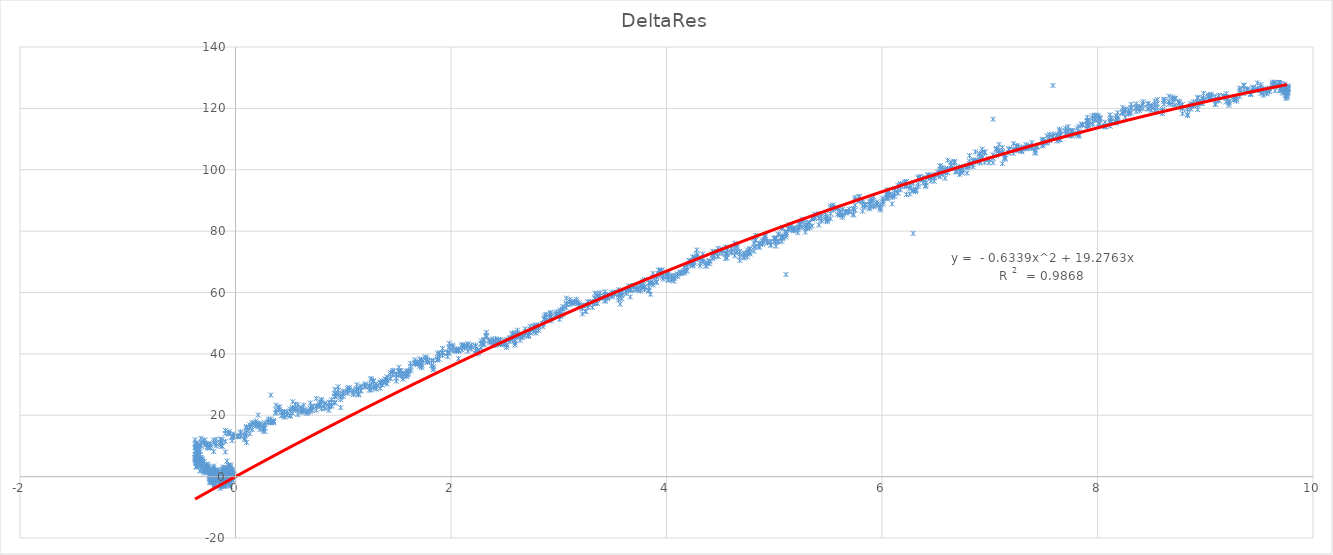
| Category | DeltaRes |
|---|---|
| 9.765999999999998 | 125.282 |
| 9.765999999999998 | 124.754 |
| 9.765999999999998 | 126.365 |
| 9.765999999999998 | 127.049 |
| 9.765999999999998 | 126.06 |
| 9.765999999999998 | 125.188 |
| 9.765999999999998 | 126.565 |
| 9.765999999999998 | 126.454 |
| 9.758 | 126.799 |
| 9.758 | 124.077 |
| 9.758 | 123.571 |
| 9.758 | 124.226 |
| 9.758 | 124.271 |
| 9.758 | 124.015 |
| 9.758 | 125.282 |
| 9.758 | 126.332 |
| 9.765999999999998 | 127.288 |
| 9.765999999999998 | 126.604 |
| 9.765999999999998 | 126.66 |
| 9.765999999999998 | 126.049 |
| 9.75 | 126.021 |
| 9.75 | 126.299 |
| 9.75 | 125.16 |
| 9.75 | 125.421 |
| 9.75 | 126.587 |
| 9.75 | 125.799 |
| 9.75 | 125.838 |
| 9.75 | 123.21 |
| 9.742 | 125.049 |
| 9.742 | 124.199 |
| 9.742 | 125.654 |
| 9.742 | 126.86 |
| 9.734000000000002 | 125.954 |
| 9.734000000000002 | 126.521 |
| 9.734000000000002 | 125.949 |
| 9.734000000000002 | 127.949 |
| 9.719000000000001 | 125.515 |
| 9.719000000000001 | 126.41 |
| 9.719000000000001 | 126.004 |
| 9.719000000000001 | 124.949 |
| 9.703 | 126.415 |
| 9.703 | 125.993 |
| 9.703 | 126.099 |
| 9.703 | 128.032 |
| 9.687999999999999 | 127.299 |
| 9.687999999999999 | 125.754 |
| 9.687999999999999 | 128.143 |
| 9.687999999999999 | 128.449 |
| 9.68 | 127.676 |
| 9.68 | 127.627 |
| 9.68 | 127.615 |
| 9.68 | 128.454 |
| 9.648 | 128.11 |
| 9.648 | 128.443 |
| 9.648 | 127.482 |
| 9.648 | 125.799 |
| 9.625 | 128.549 |
| 9.625 | 127.738 |
| 9.625 | 128.154 |
| 9.625 | 127.377 |
| 9.594000000000001 | 126.493 |
| 9.594000000000001 | 126.56 |
| 9.594000000000001 | 125.382 |
| 9.594000000000001 | 125.788 |
| 9.57 | 124.971 |
| 9.57 | 125.716 |
| 9.57 | 124.771 |
| 9.57 | 125.693 |
| 9.539000000000001 | 124.288 |
| 9.539000000000001 | 125.243 |
| 9.539000000000001 | 126.404 |
| 9.539000000000001 | 126.271 |
| 9.515999999999998 | 127.765 |
| 9.515999999999998 | 127.049 |
| 9.515999999999998 | 125.815 |
| 9.515999999999998 | 124.899 |
| 9.484000000000002 | 125.832 |
| 9.484000000000002 | 126.454 |
| 9.484000000000002 | 128.282 |
| 9.484000000000002 | 126.227 |
| 9.445 | 126.649 |
| 9.445 | 126.543 |
| 9.445 | 126.86 |
| 9.445 | 125.96 |
| 9.422 | 124.515 |
| 9.422 | 125.51 |
| 9.422 | 124.849 |
| 9.422 | 124.532 |
| 9.390999999999998 | 125.843 |
| 9.390999999999998 | 125.971 |
| 9.390999999999998 | 126.027 |
| 9.390999999999998 | 126.376 |
| 9.359000000000002 | 127.393 |
| 9.359000000000002 | 127.588 |
| 9.359000000000002 | 124.821 |
| 9.359000000000002 | 126.193 |
| 9.32 | 125.96 |
| 9.32 | 126.616 |
| 9.32 | 125.26 |
| 9.32 | 123.871 |
| 9.289000000000001 | 123.065 |
| 9.289000000000001 | 123.527 |
| 9.289000000000001 | 122.938 |
| 9.289000000000001 | 122.371 |
| 9.265999999999998 | 123.516 |
| 9.265999999999998 | 122.982 |
| 9.265999999999998 | 122.771 |
| 9.265999999999998 | 123.71 |
| 9.219000000000001 | 122.488 |
| 9.219000000000001 | 121.61 |
| 9.219000000000001 | 121.027 |
| 9.219000000000001 | 122.043 |
| 9.195 | 123.443 |
| 9.195 | 122.116 |
| 9.195 | 123.927 |
| 9.195 | 124.799 |
| 9.172 | 123.577 |
| 9.172 | 123.749 |
| 9.172 | 124.016 |
| 9.172 | 123.999 |
| 9.125 | 122.649 |
| 9.125 | 124.154 |
| 9.125 | 124.138 |
| 9.125 | 122.404 |
| 9.094000000000001 | 122.465 |
| 9.094000000000001 | 121.443 |
| 9.094000000000001 | 123.854 |
| 9.094000000000001 | 121.232 |
| 9.055 | 123.532 |
| 9.055 | 124.604 |
| 9.055 | 123.655 |
| 9.055 | 124.199 |
| 9.030999999999999 | 123.843 |
| 9.030999999999999 | 123.455 |
| 9.030999999999999 | 124.099 |
| 9.030999999999999 | 124.377 |
| 8.984000000000002 | 122.893 |
| 8.984000000000002 | 123.432 |
| 8.984000000000002 | 122.615 |
| 8.984000000000002 | 124.882 |
| 8.969000000000001 | 123.199 |
| 8.969000000000001 | 122.26 |
| 8.969000000000001 | 121.632 |
| 8.969000000000001 | 121.538 |
| 8.93 | 122.099 |
| 8.93 | 121.849 |
| 8.93 | 119.588 |
| 8.93 | 121.688 |
| 8.93 | 123.343 |
| 8.93 | 121.56 |
| 8.93 | 120.982 |
| 8.93 | 123.61 |
| 8.890999999999998 | 122.105 |
| 8.890999999999998 | 120.827 |
| 8.890999999999998 | 121.138 |
| 8.890999999999998 | 120.805 |
| 8.867 | 121.549 |
| 8.867 | 121.01 |
| 8.867 | 120.749 |
| 8.867 | 119.749 |
| 8.835999999999999 | 120.188 |
| 8.835999999999999 | 117.599 |
| 8.835999999999999 | 119.671 |
| 8.835999999999999 | 118.021 |
| 8.789000000000001 | 119.832 |
| 8.789000000000001 | 118.255 |
| 8.789000000000001 | 121.304 |
| 8.789000000000001 | 120.199 |
| 8.758 | 120.416 |
| 8.758 | 121.855 |
| 8.758 | 121.716 |
| 8.758 | 122.366 |
| 8.719000000000001 | 123.343 |
| 8.719000000000001 | 123.01 |
| 8.719000000000001 | 123.06 |
| 8.719000000000001 | 121.121 |
| 8.695 | 121.36 |
| 8.695 | 123.682 |
| 8.695 | 121.954 |
| 8.695 | 123.166 |
| 8.664000000000001 | 122.099 |
| 8.664000000000001 | 122.232 |
| 8.664000000000001 | 121.41 |
| 8.664000000000001 | 123.966 |
| 8.617 | 122.865 |
| 8.617 | 122.943 |
| 8.617 | 122.293 |
| 8.617 | 121.316 |
| 8.602 | 119.177 |
| 8.602 | 119.649 |
| 8.602 | 119.082 |
| 8.602 | 118.254 |
| 8.555 | 118.905 |
| 8.555 | 120.316 |
| 8.555 | 121.538 |
| 8.555 | 122.832 |
| 8.530999999999999 | 122.399 |
| 8.530999999999999 | 121.254 |
| 8.530999999999999 | 119.21 |
| 8.530999999999999 | 120.482 |
| 8.5 | 120.91 |
| 8.5 | 119.354 |
| 8.5 | 120.743 |
| 8.5 | 120.76 |
| 8.469000000000001 | 119.727 |
| 8.469000000000001 | 120.043 |
| 8.469000000000001 | 121.427 |
| 8.469000000000001 | 121.632 |
| 8.422 | 121.443 |
| 8.422 | 122.204 |
| 8.422 | 121.432 |
| 8.422 | 119.926 |
| 8.390999999999998 | 119.865 |
| 8.390999999999998 | 120.671 |
| 8.390999999999998 | 120.038 |
| 8.390999999999998 | 119.238 |
| 8.359000000000002 | 120.543 |
| 8.359000000000002 | 118.999 |
| 8.359000000000002 | 119.988 |
| 8.359000000000002 | 121.46 |
| 8.312000000000001 | 119.971 |
| 8.312000000000001 | 120.249 |
| 8.312000000000001 | 118.466 |
| 8.312000000000001 | 121.327 |
| 8.289000000000001 | 118.404 |
| 8.289000000000001 | 118.127 |
| 8.289000000000001 | 119.454 |
| 8.289000000000001 | 118.532 |
| 8.258 | 117.121 |
| 8.258 | 118.921 |
| 8.258 | 119.554 |
| 8.258 | 119.766 |
| 8.234000000000002 | 118.282 |
| 8.234000000000002 | 119.021 |
| 8.234000000000002 | 118.721 |
| 8.234000000000002 | 120.238 |
| 8.187999999999999 | 115.943 |
| 8.187999999999999 | 116.499 |
| 8.187999999999999 | 117.193 |
| 8.187999999999999 | 118.61 |
| 8.172 | 117.627 |
| 8.172 | 115.549 |
| 8.172 | 115.21 |
| 8.172 | 116.738 |
| 8.125 | 115.915 |
| 8.125 | 115.56 |
| 8.125 | 116.91 |
| 8.125 | 115.965 |
| 8.117 | 114.215 |
| 8.117 | 117.91 |
| 8.117 | 116.321 |
| 8.117 | 115.616 |
| 8.07 | 114.26 |
| 8.07 | 113.954 |
| 8.07 | 115.504 |
| 8.07 | 114.093 |
| 8.023 | 115.038 |
| 8.023 | 116.643 |
| 8.023 | 117.026 |
| 8.023 | 116.421 |
| 8.008 | 117.732 |
| 8.008 | 116.643 |
| 8.008 | 117.115 |
| 8.008 | 115.065 |
| 7.977 | 116.082 |
| 7.977 | 116.61 |
| 7.977 | 117.543 |
| 7.977 | 117.838 |
| 7.952999999999999 | 116.621 |
| 7.952999999999999 | 114.754 |
| 7.952999999999999 | 115.254 |
| 7.952999999999999 | 117.543 |
| 7.9140000000000015 | 115.86 |
| 7.9140000000000015 | 115.832 |
| 7.9140000000000015 | 114.854 |
| 7.9140000000000015 | 114.388 |
| 7.905999999999999 | 114.521 |
| 7.905999999999999 | 115.688 |
| 7.905999999999999 | 115.777 |
| 7.905999999999999 | 116.071 |
| 7.905999999999999 | 115.132 |
| 7.905999999999999 | 117.071 |
| 7.905999999999999 | 114.149 |
| 7.905999999999999 | 113.393 |
| 7.859000000000002 | 114.499 |
| 7.859000000000002 | 114.693 |
| 7.859000000000002 | 114.56 |
| 7.859000000000002 | 114.899 |
| 7.827999999999999 | 114.177 |
| 7.827999999999999 | 112.438 |
| 7.827999999999999 | 111.426 |
| 7.827999999999999 | 110.904 |
| 7.812000000000001 | 111.954 |
| 7.812000000000001 | 111.36 |
| 7.812000000000001 | 111.793 |
| 7.812000000000001 | 113.582 |
| 7.765999999999998 | 112.621 |
| 7.765999999999998 | 112.699 |
| 7.765999999999998 | 111.154 |
| 7.765999999999998 | 112.81 |
| 7.757999999999999 | 112.288 |
| 7.757999999999999 | 111.01 |
| 7.757999999999999 | 112.621 |
| 7.757999999999999 | 112.388 |
| 7.727 | 114.06 |
| 7.727 | 112.377 |
| 7.727 | 111.099 |
| 7.727 | 112.593 |
| 7.702999999999999 | 112.727 |
| 7.702999999999999 | 113.571 |
| 7.702999999999999 | 112.627 |
| 7.702999999999999 | 111.693 |
| 7.648 | 113.221 |
| 7.648 | 110.882 |
| 7.648 | 112.721 |
| 7.648 | 109.888 |
| 7.655999999999999 | 112.371 |
| 7.655999999999999 | 111.327 |
| 7.655999999999999 | 111.332 |
| 7.655999999999999 | 109.716 |
| 7.625 | 109.327 |
| 7.625 | 111.443 |
| 7.625 | 110.932 |
| 7.625 | 111.204 |
| 7.5859999999999985 | 110.888 |
| 7.5859999999999985 | 127.464 |
| 7.5859999999999985 | 110.782 |
| 7.5859999999999985 | 111.643 |
| 7.555 | 111.504 |
| 7.555 | 109.699 |
| 7.555 | 110.393 |
| 7.555 | 109.477 |
| 7.530999999999999 | 108.871 |
| 7.530999999999999 | 111.082 |
| 7.530999999999999 | 108.671 |
| 7.530999999999999 | 109.304 |
| 7.492000000000001 | 107.804 |
| 7.492000000000001 | 109.765 |
| 7.492000000000001 | 107.91 |
| 7.492000000000001 | 108.399 |
| 7.492000000000001 | 109.204 |
| 7.492000000000001 | 108.999 |
| 7.492000000000001 | 109.615 |
| 7.492000000000001 | 109.927 |
| 7.437999999999999 | 107.51 |
| 7.437999999999999 | 107.638 |
| 7.437999999999999 | 107.46 |
| 7.437999999999999 | 107.621 |
| 7.422000000000001 | 105.382 |
| 7.422000000000001 | 105.766 |
| 7.422000000000001 | 106.343 |
| 7.422000000000001 | 107.304 |
| 7.390999999999998 | 107.216 |
| 7.390999999999998 | 108.827 |
| 7.390999999999998 | 107.521 |
| 7.390999999999998 | 106.904 |
| 7.359000000000002 | 107.816 |
| 7.359000000000002 | 107.488 |
| 7.359000000000002 | 107.182 |
| 7.359000000000002 | 107.693 |
| 7.3359999999999985 | 108.221 |
| 7.3359999999999985 | 106.799 |
| 7.3359999999999985 | 107.265 |
| 7.3359999999999985 | 106.96 |
| 7.297000000000001 | 107.388 |
| 7.297000000000001 | 106.182 |
| 7.297000000000001 | 106.815 |
| 7.297000000000001 | 105.893 |
| 7.265999999999998 | 106.149 |
| 7.265999999999998 | 106.71 |
| 7.265999999999998 | 106.604 |
| 7.265999999999998 | 107.343 |
| 7.25 | 107.593 |
| 7.25 | 107.621 |
| 7.25 | 106.443 |
| 7.25 | 107.91 |
| 7.219000000000001 | 106.377 |
| 7.219000000000001 | 108.499 |
| 7.219000000000001 | 106.704 |
| 7.219000000000001 | 105.371 |
| 7.18 | 105.454 |
| 7.18 | 106.732 |
| 7.18 | 106.516 |
| 7.18 | 106.793 |
| 7.140999999999998 | 104.91 |
| 7.140999999999998 | 103.705 |
| 7.140999999999998 | 103.504 |
| 7.140999999999998 | 104.116 |
| 7.117000000000001 | 101.982 |
| 7.117000000000001 | 105.521 |
| 7.117000000000001 | 105.915 |
| 7.117000000000001 | 107.277 |
| 7.0859999999999985 | 105.432 |
| 7.0859999999999985 | 106.16 |
| 7.0859999999999985 | 106.343 |
| 7.0859999999999985 | 108.227 |
| 7.062000000000001 | 106.449 |
| 7.062000000000001 | 106.738 |
| 7.062000000000001 | 104.616 |
| 7.062000000000001 | 106.949 |
| 7.030999999999999 | 116.471 |
| 7.030999999999999 | 104.843 |
| 7.030999999999999 | 102.293 |
| 7.030999999999999 | 103.788 |
| 6.992000000000001 | 103.616 |
| 6.992000000000001 | 103.332 |
| 6.992000000000001 | 103.393 |
| 6.992000000000001 | 102.271 |
| 6.952999999999999 | 102.393 |
| 6.952999999999999 | 105.671 |
| 6.952999999999999 | 105.605 |
| 6.952999999999999 | 105.827 |
| 6.93 | 106.727 |
| 6.93 | 105.771 |
| 6.93 | 104.327 |
| 6.93 | 103.904 |
| 6.905999999999999 | 105.138 |
| 6.905999999999999 | 102.643 |
| 6.905999999999999 | 102.204 |
| 6.905999999999999 | 103.549 |
| 6.905999999999999 | 103.054 |
| 6.905999999999999 | 104.26 |
| 6.905999999999999 | 105.243 |
| 6.905999999999999 | 105.277 |
| 6.867000000000001 | 105.821 |
| 6.867000000000001 | 102.954 |
| 6.867000000000001 | 102.66 |
| 6.867000000000001 | 103.188 |
| 6.844000000000001 | 100.977 |
| 6.844000000000001 | 101.688 |
| 6.844000000000001 | 102.799 |
| 6.844000000000001 | 103.043 |
| 6.812000000000001 | 104.593 |
| 6.812000000000001 | 102.793 |
| 6.812000000000001 | 101.993 |
| 6.812000000000001 | 101.171 |
| 6.7890000000000015 | 100.632 |
| 6.7890000000000015 | 98.899 |
| 6.7890000000000015 | 100.96 |
| 6.7890000000000015 | 101.293 |
| 6.742000000000001 | 99.866 |
| 6.742000000000001 | 100.199 |
| 6.742000000000001 | 99.571 |
| 6.742000000000001 | 98.971 |
| 6.719000000000001 | 98.471 |
| 6.719000000000001 | 100.388 |
| 6.719000000000001 | 99.91 |
| 6.719000000000001 | 100.999 |
| 6.687999999999999 | 99.482 |
| 6.687999999999999 | 99.654 |
| 6.687999999999999 | 99.216 |
| 6.687999999999999 | 100.516 |
| 6.672000000000001 | 100.349 |
| 6.672000000000001 | 102.51 |
| 6.672000000000001 | 102.166 |
| 6.672000000000001 | 102.721 |
| 6.640999999999998 | 101.177 |
| 6.640999999999998 | 102.493 |
| 6.640999999999998 | 101.477 |
| 6.640999999999998 | 100.488 |
| 6.609000000000002 | 99.916 |
| 6.609000000000002 | 103.071 |
| 6.609000000000002 | 100.41 |
| 6.609000000000002 | 99.06 |
| 6.5859999999999985 | 97.182 |
| 6.5859999999999985 | 99.766 |
| 6.5859999999999985 | 100.343 |
| 6.5859999999999985 | 98.916 |
| 6.562000000000001 | 98.56 |
| 6.562000000000001 | 99.943 |
| 6.562000000000001 | 99.354 |
| 6.562000000000001 | 100.827 |
| 6.5390000000000015 | 101.299 |
| 6.5390000000000015 | 101.154 |
| 6.5390000000000015 | 100.132 |
| 6.5390000000000015 | 97.693 |
| 6.523 | 98.288 |
| 6.523 | 98.271 |
| 6.523 | 98.971 |
| 6.523 | 99.332 |
| 6.484000000000002 | 97.782 |
| 6.484000000000002 | 98.432 |
| 6.484000000000002 | 97.36 |
| 6.484000000000002 | 96.26 |
| 6.452999999999999 | 96.343 |
| 6.452999999999999 | 98.016 |
| 6.452999999999999 | 97.238 |
| 6.452999999999999 | 97.505 |
| 6.43 | 98.377 |
| 6.43 | 98.293 |
| 6.43 | 97.921 |
| 6.43 | 97.405 |
| 6.405999999999999 | 94.877 |
| 6.405999999999999 | 94.555 |
| 6.405999999999999 | 95.693 |
| 6.405999999999999 | 95.749 |
| 6.382999999999999 | 96.849 |
| 6.382999999999999 | 96.816 |
| 6.382999999999999 | 97.532 |
| 6.382999999999999 | 95.688 |
| 6.352 | 96.838 |
| 6.352 | 96.927 |
| 6.352 | 97.76 |
| 6.352 | 97.638 |
| 6.3359999999999985 | 97.377 |
| 6.3359999999999985 | 97.343 |
| 6.3359999999999985 | 95.243 |
| 6.3359999999999985 | 94.555 |
| 6.312000000000001 | 93.255 |
| 6.312000000000001 | 93.682 |
| 6.312000000000001 | 93.432 |
| 6.312000000000001 | 92.86 |
| 6.2890000000000015 | 93.399 |
| 6.2890000000000015 | 93.027 |
| 6.2890000000000015 | 79.255 |
| 6.2890000000000015 | 95.455 |
| 6.257999999999999 | 92.099 |
| 6.257999999999999 | 94.866 |
| 6.257999999999999 | 94.855 |
| 6.257999999999999 | 93.827 |
| 6.227 | 91.921 |
| 6.227 | 94.516 |
| 6.227 | 94.66 |
| 6.227 | 96.166 |
| 6.2109999999999985 | 95.632 |
| 6.2109999999999985 | 95.294 |
| 6.2109999999999985 | 94.521 |
| 6.2109999999999985 | 96.116 |
| 6.172000000000001 | 94.671 |
| 6.172000000000001 | 93.438 |
| 6.172000000000001 | 95.171 |
| 6.172000000000001 | 95.477 |
| 6.148 | 92.455 |
| 6.148 | 94.932 |
| 6.148 | 93.682 |
| 6.148 | 92.455 |
| 6.117000000000001 | 93.849 |
| 6.117000000000001 | 91.36 |
| 6.117000000000001 | 92.088 |
| 6.117000000000001 | 93.232 |
| 6.094000000000001 | 90.938 |
| 6.094000000000001 | 88.883 |
| 6.094000000000001 | 91.738 |
| 6.094000000000001 | 91.432 |
| 6.062000000000001 | 91.56 |
| 6.062000000000001 | 93.16 |
| 6.062000000000001 | 91.877 |
| 6.062000000000001 | 91.777 |
| 6.047000000000001 | 93.488 |
| 6.047000000000001 | 91.844 |
| 6.047000000000001 | 90.66 |
| 6.047000000000001 | 90.577 |
| 6.047000000000001 | 92.482 |
| 6.047000000000001 | 91.066 |
| 6.047000000000001 | 90.982 |
| 6.047000000000001 | 91.788 |
| 6.007999999999999 | 90.044 |
| 6.007999999999999 | 90.682 |
| 6.007999999999999 | 88.766 |
| 6.007999999999999 | 89.449 |
| 5.984000000000002 | 87.732 |
| 5.984000000000002 | 87.466 |
| 5.984000000000002 | 86.899 |
| 5.984000000000002 | 88.494 |
| 5.952999999999999 | 88.355 |
| 5.952999999999999 | 88.827 |
| 5.952999999999999 | 89.527 |
| 5.952999999999999 | 88.732 |
| 5.922000000000001 | 87.899 |
| 5.922000000000001 | 88.232 |
| 5.922000000000001 | 90.044 |
| 5.922000000000001 | 91.21 |
| 5.898 | 89.577 |
| 5.898 | 89.949 |
| 5.898 | 90.571 |
| 5.898 | 88.071 |
| 5.882999999999999 | 87.521 |
| 5.882999999999999 | 89.527 |
| 5.882999999999999 | 88.727 |
| 5.882999999999999 | 87.293 |
| 5.844000000000001 | 88.716 |
| 5.844000000000001 | 88.705 |
| 5.844000000000001 | 87.888 |
| 5.844000000000001 | 88.51 |
| 5.82 | 89.488 |
| 5.82 | 86.493 |
| 5.82 | 88.171 |
| 5.82 | 90.105 |
| 5.7890000000000015 | 89.755 |
| 5.7890000000000015 | 91.082 |
| 5.7890000000000015 | 89.955 |
| 5.7890000000000015 | 91.31 |
| 5.75 | 90.993 |
| 5.75 | 90.332 |
| 5.75 | 88.482 |
| 5.75 | 86.788 |
| 5.734000000000002 | 87.044 |
| 5.734000000000002 | 85.243 |
| 5.734000000000002 | 85.538 |
| 5.734000000000002 | 87.427 |
| 5.695 | 86.243 |
| 5.695 | 86.36 |
| 5.695 | 86.366 |
| 5.695 | 87.221 |
| 5.6640000000000015 | 85.832 |
| 5.6640000000000015 | 86.327 |
| 5.6640000000000015 | 86.244 |
| 5.6640000000000015 | 86.455 |
| 5.632999999999999 | 85.455 |
| 5.632999999999999 | 84.516 |
| 5.632999999999999 | 85.16 |
| 5.632999999999999 | 87.105 |
| 5.609000000000002 | 85.91 |
| 5.609000000000002 | 86.855 |
| 5.609000000000002 | 86.005 |
| 5.609000000000002 | 85.144 |
| 5.5859999999999985 | 85.46 |
| 5.5859999999999985 | 87.377 |
| 5.5859999999999985 | 87.243 |
| 5.5859999999999985 | 87.599 |
| 5.547000000000001 | 86.844 |
| 5.547000000000001 | 87.899 |
| 5.547000000000001 | 88.493 |
| 5.547000000000001 | 87.521 |
| 5.523 | 87.649 |
| 5.523 | 88.193 |
| 5.523 | 85.688 |
| 5.523 | 84.038 |
| 5.492000000000001 | 83.416 |
| 5.492000000000001 | 83.088 |
| 5.492000000000001 | 83.777 |
| 5.492000000000001 | 84.221 |
| 5.477 | 84.082 |
| 5.477 | 84.688 |
| 5.477 | 84.749 |
| 5.477 | 85.36 |
| 5.437999999999999 | 83.605 |
| 5.437999999999999 | 83.321 |
| 5.437999999999999 | 85.521 |
| 5.437999999999999 | 84.821 |
| 5.4140000000000015 | 84.16 |
| 5.4140000000000015 | 81.994 |
| 5.4140000000000015 | 85.605 |
| 5.4140000000000015 | 84.216 |
| 5.375 | 84.066 |
| 5.375 | 84.527 |
| 5.375 | 85.494 |
| 5.375 | 84.538 |
| 5.352 | 84.299 |
| 5.352 | 84.205 |
| 5.352 | 83.899 |
| 5.352 | 81.671 |
| 5.327999999999999 | 82.738 |
| 5.327999999999999 | 82.816 |
| 5.327999999999999 | 81.305 |
| 5.327999999999999 | 81.049 |
| 5.305 | 81.966 |
| 5.305 | 80.894 |
| 5.305 | 82.371 |
| 5.305 | 81.921 |
| 5.2890000000000015 | 80.91 |
| 5.2890000000000015 | 79.683 |
| 5.2890000000000015 | 83.794 |
| 5.2890000000000015 | 81.577 |
| 5.257999999999999 | 83.183 |
| 5.257999999999999 | 83.094 |
| 5.257999999999999 | 83.905 |
| 5.257999999999999 | 81.344 |
| 5.234000000000002 | 82.899 |
| 5.234000000000002 | 81.288 |
| 5.234000000000002 | 82.477 |
| 5.234000000000002 | 81.916 |
| 5.219000000000001 | 80.471 |
| 5.219000000000001 | 81.044 |
| 5.219000000000001 | 79.477 |
| 5.219000000000001 | 81.177 |
| 5.18 | 80.483 |
| 5.18 | 80.927 |
| 5.18 | 80.255 |
| 5.18 | 80.094 |
| 5.1640000000000015 | 80.755 |
| 5.1640000000000015 | 80.783 |
| 5.1640000000000015 | 80.41 |
| 5.1640000000000015 | 82.171 |
| 5.132999999999999 | 82.038 |
| 5.132999999999999 | 80.938 |
| 5.132999999999999 | 80.555 |
| 5.132999999999999 | 80.81 |
| 5.109000000000002 | 79.633 |
| 5.109000000000002 | 78.96 |
| 5.109000000000002 | 79.633 |
| 5.109000000000002 | 79.638 |
| 5.109000000000002 | 78.116 |
| 5.109000000000002 | 65.849 |
| 5.109000000000002 | 78.883 |
| 5.109000000000002 | 79.488 |
| 5.077999999999999 | 77.46 |
| 5.077999999999999 | 78.477 |
| 5.077999999999999 | 77.949 |
| 5.077999999999999 | 81.16 |
| 5.07 | 80.849 |
| 5.07 | 78.31 |
| 5.07 | 78.049 |
| 5.07 | 76.66 |
| 5.0390000000000015 | 78.805 |
| 5.0390000000000015 | 76.744 |
| 5.0390000000000015 | 79.071 |
| 5.0390000000000015 | 76.521 |
| 5.015999999999998 | 76.366 |
| 5.015999999999998 | 77.733 |
| 5.015999999999998 | 77.499 |
| 5.015999999999998 | 75.077 |
| 5.0 | 76.56 |
| 5.0 | 77.705 |
| 5.0 | 77.56 |
| 5.0 | 77.71 |
| 4.969000000000001 | 76.616 |
| 4.969000000000001 | 75.516 |
| 4.969000000000001 | 75.438 |
| 4.969000000000001 | 75.46 |
| 4.937999999999999 | 76.76 |
| 4.937999999999999 | 76.133 |
| 4.937999999999999 | 76.294 |
| 4.937999999999999 | 76.338 |
| 4.9140000000000015 | 77.766 |
| 4.9140000000000015 | 77.216 |
| 4.9140000000000015 | 78.538 |
| 4.9140000000000015 | 78.249 |
| 4.890999999999998 | 77.094 |
| 4.890999999999998 | 76.572 |
| 4.890999999999998 | 75.999 |
| 4.890999999999998 | 75.705 |
| 4.859000000000002 | 74.666 |
| 4.859000000000002 | 76.122 |
| 4.859000000000002 | 75.899 |
| 4.859000000000002 | 75.06 |
| 4.827999999999999 | 75.077 |
| 4.827999999999999 | 77.11 |
| 4.827999999999999 | 78.56 |
| 4.827999999999999 | 77.044 |
| 4.812000000000001 | 77.683 |
| 4.812000000000001 | 76.216 |
| 4.812000000000001 | 74.783 |
| 4.812000000000001 | 73.422 |
| 4.773 | 72.966 |
| 4.773 | 72.577 |
| 4.773 | 74.321 |
| 4.773 | 74.127 |
| 4.75 | 73.855 |
| 4.75 | 73.038 |
| 4.75 | 71.616 |
| 4.75 | 72.522 |
| 4.719000000000001 | 71.716 |
| 4.719000000000001 | 72.899 |
| 4.719000000000001 | 71.255 |
| 4.719000000000001 | 72.372 |
| 4.68 | 72.549 |
| 4.68 | 73.433 |
| 4.68 | 70.433 |
| 4.68 | 71.699 |
| 4.655999999999999 | 74.777 |
| 4.655999999999999 | 73.271 |
| 4.655999999999999 | 73.305 |
| 4.655999999999999 | 75.316 |
| 4.632999999999999 | 76.06 |
| 4.632999999999999 | 74.666 |
| 4.632999999999999 | 73.277 |
| 4.632999999999999 | 71.949 |
| 4.602 | 74.394 |
| 4.602 | 72.888 |
| 4.602 | 73.266 |
| 4.602 | 74.177 |
| 4.562000000000001 | 72.366 |
| 4.562000000000001 | 71.205 |
| 4.562000000000001 | 72.777 |
| 4.562000000000001 | 73.849 |
| 4.547000000000001 | 74.849 |
| 4.547000000000001 | 72.899 |
| 4.547000000000001 | 72.416 |
| 4.547000000000001 | 71.138 |
| 4.515999999999998 | 72.71 |
| 4.515999999999998 | 74.194 |
| 4.515999999999998 | 73.799 |
| 4.515999999999998 | 73.627 |
| 4.477 | 73.255 |
| 4.477 | 74.405 |
| 4.477 | 71.855 |
| 4.477 | 71.772 |
| 4.445 | 73.272 |
| 4.445 | 71.51 |
| 4.445 | 72.944 |
| 4.445 | 72.888 |
| 4.43 | 72.127 |
| 4.43 | 72.51 |
| 4.43 | 73.427 |
| 4.43 | 71.038 |
| 4.398 | 70.344 |
| 4.398 | 70.238 |
| 4.398 | 69.36 |
| 4.398 | 69.994 |
| 4.367000000000001 | 69.51 |
| 4.367000000000001 | 68.705 |
| 4.367000000000001 | 69.672 |
| 4.367000000000001 | 68.56 |
| 4.3359999999999985 | 70.205 |
| 4.3359999999999985 | 72.555 |
| 4.3359999999999985 | 70.983 |
| 4.3359999999999985 | 70.044 |
| 4.312000000000001 | 68.683 |
| 4.312000000000001 | 69.499 |
| 4.312000000000001 | 70.855 |
| 4.312000000000001 | 71.249 |
| 4.280999999999999 | 73.855 |
| 4.280999999999999 | 71.877 |
| 4.280999999999999 | 71.883 |
| 4.280999999999999 | 72.649 |
| 4.257999999999999 | 71.372 |
| 4.257999999999999 | 71.394 |
| 4.257999999999999 | 70.01 |
| 4.257999999999999 | 69.538 |
| 4.242000000000001 | 68.749 |
| 4.242000000000001 | 69.922 |
| 4.242000000000001 | 68.999 |
| 4.242000000000001 | 71.633 |
| 4.242000000000001 | 68.772 |
| 4.242000000000001 | 69.338 |
| 4.242000000000001 | 68.722 |
| 4.242000000000001 | 69.388 |
| 4.2109999999999985 | 70.366 |
| 4.2109999999999985 | 69.622 |
| 4.2109999999999985 | 70.438 |
| 4.2109999999999985 | 69.394 |
| 4.187999999999999 | 68.877 |
| 4.187999999999999 | 67.26 |
| 4.187999999999999 | 68.033 |
| 4.187999999999999 | 66.944 |
| 4.1640000000000015 | 67.188 |
| 4.1640000000000015 | 68.305 |
| 4.1640000000000015 | 66.36 |
| 4.1640000000000015 | 66.705 |
| 4.132999999999999 | 66.177 |
| 4.132999999999999 | 66.388 |
| 4.132999999999999 | 66.31 |
| 4.132999999999999 | 66.716 |
| 4.102 | 66.055 |
| 4.102 | 65.899 |
| 4.102 | 65.238 |
| 4.102 | 65.255 |
| 4.07 | 65.555 |
| 4.07 | 63.699 |
| 4.07 | 64.544 |
| 4.07 | 64.827 |
| 4.047000000000001 | 65.466 |
| 4.047000000000001 | 65.333 |
| 4.047000000000001 | 64.277 |
| 4.047000000000001 | 64.105 |
| 4.015999999999998 | 64.005 |
| 4.015999999999998 | 65.016 |
| 4.015999999999998 | 64.205 |
| 4.015999999999998 | 65.91 |
| 4.007999999999999 | 66.005 |
| 4.007999999999999 | 65.144 |
| 4.007999999999999 | 65.566 |
| 4.007999999999999 | 66.222 |
| 3.969000000000001 | 64.394 |
| 3.969000000000001 | 65.899 |
| 3.969000000000001 | 65.172 |
| 3.969000000000001 | 65.066 |
| 3.9529999999999994 | 67.249 |
| 3.9529999999999994 | 66.772 |
| 3.9529999999999994 | 67.272 |
| 3.9529999999999994 | 67.222 |
| 3.9299999999999997 | 67.316 |
| 3.9299999999999997 | 67.199 |
| 3.9299999999999997 | 66.066 |
| 3.9299999999999997 | 65.46 |
| 3.905999999999999 | 63.51 |
| 3.905999999999999 | 63.233 |
| 3.905999999999999 | 64.977 |
| 3.905999999999999 | 65.149 |
| 3.875 | 66.199 |
| 3.875 | 63.072 |
| 3.875 | 64.888 |
| 3.875 | 62.472 |
| 3.8520000000000003 | 63.166 |
| 3.8520000000000003 | 62.944 |
| 3.8520000000000003 | 59.438 |
| 3.8520000000000003 | 63.361 |
| 3.8359999999999985 | 60.405 |
| 3.8359999999999985 | 63.216 |
| 3.8359999999999985 | 60.738 |
| 3.8359999999999985 | 61.666 |
| 3.7970000000000006 | 61.655 |
| 3.7970000000000006 | 60.944 |
| 3.7970000000000006 | 61.855 |
| 3.7970000000000006 | 64.277 |
| 3.780999999999999 | 62.088 |
| 3.780999999999999 | 63.81 |
| 3.780999999999999 | 62.577 |
| 3.780999999999999 | 61.672 |
| 3.757999999999999 | 60.488 |
| 3.757999999999999 | 62.383 |
| 3.757999999999999 | 61.155 |
| 3.757999999999999 | 61.838 |
| 3.7270000000000003 | 60.749 |
| 3.7270000000000003 | 61.072 |
| 3.7270000000000003 | 61.494 |
| 3.7270000000000003 | 62.349 |
| 3.6950000000000003 | 62.055 |
| 3.6950000000000003 | 62.16 |
| 3.6950000000000003 | 60.91 |
| 3.6950000000000003 | 62.099 |
| 3.6640000000000015 | 61.061 |
| 3.6640000000000015 | 58.555 |
| 3.6640000000000015 | 60.916 |
| 3.6640000000000015 | 60.638 |
| 3.6479999999999997 | 61.277 |
| 3.6479999999999997 | 61.138 |
| 3.6479999999999997 | 60.788 |
| 3.6479999999999997 | 62.133 |
| 3.625 | 60.355 |
| 3.625 | 60.438 |
| 3.625 | 59.633 |
| 3.625 | 60.533 |
| 3.5859999999999985 | 57.955 |
| 3.5859999999999985 | 59.811 |
| 3.5859999999999985 | 60.027 |
| 3.5859999999999985 | 59.172 |
| 3.5700000000000003 | 59.955 |
| 3.5700000000000003 | 59.516 |
| 3.5700000000000003 | 59.96 |
| 3.5700000000000003 | 56.205 |
| 3.5549999999999997 | 57.611 |
| 3.5549999999999997 | 58.433 |
| 3.5549999999999997 | 59.372 |
| 3.5549999999999997 | 60.905 |
| 3.5159999999999982 | 59.566 |
| 3.5159999999999982 | 60.199 |
| 3.5159999999999982 | 59.938 |
| 3.5159999999999982 | 59.399 |
| 3.492000000000001 | 59.177 |
| 3.492000000000001 | 59.91 |
| 3.492000000000001 | 58.799 |
| 3.492000000000001 | 58.583 |
| 3.4529999999999994 | 59.316 |
| 3.4529999999999994 | 58.288 |
| 3.4529999999999994 | 58.011 |
| 3.4529999999999994 | 58.594 |
| 3.4299999999999997 | 59.405 |
| 3.4299999999999997 | 58.749 |
| 3.4299999999999997 | 58.411 |
| 3.4299999999999997 | 57.133 |
| 3.4299999999999997 | 57.455 |
| 3.4299999999999997 | 60.238 |
| 3.4299999999999997 | 58.466 |
| 3.4299999999999997 | 58.377 |
| 3.382999999999999 | 58.866 |
| 3.382999999999999 | 58.149 |
| 3.382999999999999 | 59.955 |
| 3.382999999999999 | 58.144 |
| 3.3590000000000018 | 59.511 |
| 3.3590000000000018 | 56.472 |
| 3.3590000000000018 | 56.433 |
| 3.3590000000000018 | 58.699 |
| 3.3359999999999985 | 56.366 |
| 3.3359999999999985 | 59.777 |
| 3.3359999999999985 | 58.249 |
| 3.3359999999999985 | 57.888 |
| 3.312000000000001 | 56.799 |
| 3.312000000000001 | 55.161 |
| 3.312000000000001 | 56.655 |
| 3.312000000000001 | 57.105 |
| 3.2729999999999997 | 57.016 |
| 3.2729999999999997 | 56.927 |
| 3.2729999999999997 | 56.149 |
| 3.2729999999999997 | 55.161 |
| 3.25 | 53.755 |
| 3.25 | 53.888 |
| 3.25 | 55.744 |
| 3.25 | 55.811 |
| 3.219000000000001 | 55.783 |
| 3.219000000000001 | 54.922 |
| 3.219000000000001 | 54.727 |
| 3.219000000000001 | 53.005 |
| 3.187999999999999 | 55.527 |
| 3.187999999999999 | 55.649 |
| 3.187999999999999 | 56.027 |
| 3.187999999999999 | 56.599 |
| 3.1640000000000015 | 56.949 |
| 3.1640000000000015 | 56.666 |
| 3.1640000000000015 | 57.094 |
| 3.1640000000000015 | 57.772 |
| 3.132999999999999 | 56.627 |
| 3.132999999999999 | 56.622 |
| 3.132999999999999 | 56.994 |
| 3.132999999999999 | 56.416 |
| 3.1020000000000003 | 56.905 |
| 3.1020000000000003 | 57.722 |
| 3.1020000000000003 | 56.094 |
| 3.1020000000000003 | 57.044 |
| 3.0700000000000003 | 58.155 |
| 3.0700000000000003 | 56.083 |
| 3.0700000000000003 | 56.511 |
| 3.0700000000000003 | 54.977 |
| 3.0390000000000015 | 54.516 |
| 3.0390000000000015 | 55.416 |
| 3.0390000000000015 | 54.711 |
| 3.0390000000000015 | 52.866 |
| 3.0159999999999982 | 52.316 |
| 3.0159999999999982 | 54.316 |
| 3.0159999999999982 | 52.633 |
| 3.0159999999999982 | 52.177 |
| 3.007999999999999 | 51.255 |
| 3.007999999999999 | 52.933 |
| 3.007999999999999 | 53.922 |
| 3.007999999999999 | 53.444 |
| 2.9770000000000003 | 52.822 |
| 2.9770000000000003 | 53.677 |
| 2.9770000000000003 | 52.483 |
| 2.9770000000000003 | 53.122 |
| 2.9299999999999997 | 52.877 |
| 2.9299999999999997 | 51.444 |
| 2.9299999999999997 | 50.794 |
| 2.9299999999999997 | 52.216 |
| 2.9220000000000006 | 53.472 |
| 2.9220000000000006 | 53.249 |
| 2.9220000000000006 | 52.261 |
| 2.9220000000000006 | 51.888 |
| 2.882999999999999 | 52.827 |
| 2.882999999999999 | 52.683 |
| 2.882999999999999 | 50.799 |
| 2.882999999999999 | 51.961 |
| 2.867000000000001 | 51.327 |
| 2.867000000000001 | 52.294 |
| 2.867000000000001 | 51.311 |
| 2.867000000000001 | 51.444 |
| 2.8520000000000003 | 49.649 |
| 2.8520000000000003 | 48.894 |
| 2.8520000000000003 | 49.766 |
| 2.8520000000000003 | 49.905 |
| 2.812000000000001 | 49.338 |
| 2.812000000000001 | 47.644 |
| 2.812000000000001 | 48.405 |
| 2.812000000000001 | 48.922 |
| 2.7890000000000015 | 46.766 |
| 2.7890000000000015 | 47.538 |
| 2.7890000000000015 | 48.888 |
| 2.7890000000000015 | 49.394 |
| 2.7659999999999982 | 48.138 |
| 2.7659999999999982 | 47.244 |
| 2.7659999999999982 | 49.116 |
| 2.7659999999999982 | 48.922 |
| 2.7340000000000018 | 48.994 |
| 2.7340000000000018 | 47.077 |
| 2.7340000000000018 | 48.027 |
| 2.7340000000000018 | 46.827 |
| 2.719000000000001 | 46.266 |
| 2.719000000000001 | 45.877 |
| 2.719000000000001 | 45.688 |
| 2.719000000000001 | 47.061 |
| 2.687999999999999 | 47.161 |
| 2.687999999999999 | 46.655 |
| 2.687999999999999 | 46.155 |
| 2.687999999999999 | 48.155 |
| 2.6640000000000015 | 46.244 |
| 2.6640000000000015 | 45.716 |
| 2.6640000000000015 | 46.138 |
| 2.6640000000000015 | 45.216 |
| 2.6409999999999982 | 44.388 |
| 2.6409999999999982 | 45.611 |
| 2.6409999999999982 | 45.666 |
| 2.6409999999999982 | 46.405 |
| 2.617000000000001 | 46.044 |
| 2.617000000000001 | 46.9 |
| 2.617000000000001 | 47.744 |
| 2.617000000000001 | 45.794 |
| 2.594000000000001 | 43.566 |
| 2.594000000000001 | 44.438 |
| 2.594000000000001 | 44.294 |
| 2.594000000000001 | 42.883 |
| 2.594000000000001 | 46.361 |
| 2.594000000000001 | 45.516 |
| 2.594000000000001 | 46.844 |
| 2.594000000000001 | 45.827 |
| 2.5700000000000003 | 46.355 |
| 2.5700000000000003 | 46.283 |
| 2.5700000000000003 | 44.638 |
| 2.5700000000000003 | 46.783 |
| 2.5470000000000006 | 45.35 |
| 2.5470000000000006 | 44 |
| 2.5470000000000006 | 44.738 |
| 2.5470000000000006 | 45.011 |
| 2.5159999999999982 | 42.65 |
| 2.5159999999999982 | 42.094 |
| 2.5159999999999982 | 42.955 |
| 2.5159999999999982 | 44.622 |
| 2.492000000000001 | 43.377 |
| 2.492000000000001 | 43.088 |
| 2.492000000000001 | 44.311 |
| 2.492000000000001 | 43.388 |
| 2.4609999999999985 | 43.416 |
| 2.4609999999999985 | 43.188 |
| 2.4609999999999985 | 43.055 |
| 2.4609999999999985 | 44.655 |
| 2.437999999999999 | 44.566 |
| 2.437999999999999 | 43.683 |
| 2.437999999999999 | 44.238 |
| 2.437999999999999 | 44.538 |
| 2.4140000000000015 | 44.955 |
| 2.4140000000000015 | 42.716 |
| 2.4140000000000015 | 43.266 |
| 2.4140000000000015 | 44.277 |
| 2.3909999999999982 | 43.005 |
| 2.3909999999999982 | 44.861 |
| 2.3909999999999982 | 43.494 |
| 2.3909999999999982 | 44.022 |
| 2.3590000000000018 | 43.605 |
| 2.3590000000000018 | 44.505 |
| 2.3590000000000018 | 43.938 |
| 2.3590000000000018 | 44.388 |
| 2.3279999999999994 | 45.866 |
| 2.3279999999999994 | 46.927 |
| 2.3279999999999994 | 46.072 |
| 2.3279999999999994 | 45.488 |
| 2.3049999999999997 | 42.933 |
| 2.3049999999999997 | 44.694 |
| 2.3049999999999997 | 44.383 |
| 2.3049999999999997 | 43.344 |
| 2.280999999999999 | 44.25 |
| 2.280999999999999 | 43.455 |
| 2.280999999999999 | 43.2 |
| 2.280999999999999 | 41.977 |
| 2.25 | 41.211 |
| 2.25 | 40.594 |
| 2.25 | 40.133 |
| 2.25 | 41.283 |
| 2.2270000000000003 | 40.183 |
| 2.2270000000000003 | 41.044 |
| 2.2270000000000003 | 42.833 |
| 2.2270000000000003 | 42.4 |
| 2.187999999999999 | 41.538 |
| 2.187999999999999 | 42.916 |
| 2.187999999999999 | 42.277 |
| 2.187999999999999 | 42.255 |
| 2.155999999999999 | 42.166 |
| 2.155999999999999 | 43.322 |
| 2.155999999999999 | 42.822 |
| 2.155999999999999 | 40.883 |
| 2.125 | 42.666 |
| 2.125 | 41.894 |
| 2.125 | 42.377 |
| 2.125 | 42.727 |
| 2.1020000000000003 | 42.833 |
| 2.1020000000000003 | 42.422 |
| 2.1020000000000003 | 43 |
| 2.1020000000000003 | 41.233 |
| 2.0700000000000003 | 41.383 |
| 2.0700000000000003 | 41.105 |
| 2.0700000000000003 | 40.844 |
| 2.0700000000000003 | 38.45 |
| 2.0470000000000006 | 40.822 |
| 2.0470000000000006 | 41.144 |
| 2.0470000000000006 | 41.683 |
| 2.0470000000000006 | 41.227 |
| 2.0159999999999982 | 42.222 |
| 2.0159999999999982 | 41.044 |
| 2.0159999999999982 | 42.183 |
| 2.0159999999999982 | 42.844 |
| 1.9840000000000018 | 43.427 |
| 1.9840000000000018 | 42.377 |
| 1.9840000000000018 | 41.838 |
| 1.9840000000000018 | 40.4 |
| 1.9690000000000012 | 40.244 |
| 1.9690000000000012 | 40.588 |
| 1.9690000000000012 | 40.322 |
| 1.9690000000000012 | 39.083 |
| 1.9220000000000006 | 40.455 |
| 1.9220000000000006 | 41.75 |
| 1.9220000000000006 | 40.227 |
| 1.9220000000000006 | 39.488 |
| 1.8909999999999982 | 39.755 |
| 1.8909999999999982 | 40.327 |
| 1.8909999999999982 | 38.333 |
| 1.8909999999999982 | 39.772 |
| 1.875 | 40.216 |
| 1.875 | 38.672 |
| 1.875 | 38.166 |
| 1.875 | 37.955 |
| 1.8359999999999985 | 35.394 |
| 1.8359999999999985 | 37.905 |
| 1.8359999999999985 | 35.8 |
| 1.8359999999999985 | 34.838 |
| 1.8200000000000003 | 36.2 |
| 1.8200000000000003 | 37.777 |
| 1.8200000000000003 | 36.216 |
| 1.8200000000000003 | 37.794 |
| 1.7809999999999988 | 38.211 |
| 1.7809999999999988 | 37.222 |
| 1.7809999999999988 | 37.494 |
| 1.7809999999999988 | 37.561 |
| 1.7659999999999982 | 39.005 |
| 1.7659999999999982 | 38.644 |
| 1.7659999999999982 | 38.033 |
| 1.7659999999999982 | 38.605 |
| 1.7270000000000003 | 36.566 |
| 1.7270000000000003 | 38.155 |
| 1.7270000000000003 | 38.155 |
| 1.7270000000000003 | 37.894 |
| 1.7270000000000003 | 37.233 |
| 1.7270000000000003 | 36.444 |
| 1.7270000000000003 | 35.972 |
| 1.7270000000000003 | 35.461 |
| 1.7109999999999985 | 38.305 |
| 1.7109999999999985 | 37.361 |
| 1.7109999999999985 | 36.577 |
| 1.7109999999999985 | 36.005 |
| 1.6879999999999988 | 36.961 |
| 1.6879999999999988 | 37.45 |
| 1.6879999999999988 | 36.744 |
| 1.6879999999999988 | 36.522 |
| 1.6640000000000015 | 36.805 |
| 1.6640000000000015 | 38.055 |
| 1.6640000000000015 | 37.322 |
| 1.6640000000000015 | 36.955 |
| 1.625 | 36.9 |
| 1.625 | 36.005 |
| 1.625 | 35.05 |
| 1.625 | 34.427 |
| 1.6020000000000003 | 34.211 |
| 1.6020000000000003 | 33.244 |
| 1.6020000000000003 | 34.527 |
| 1.6020000000000003 | 33.605 |
| 1.5859999999999985 | 32.65 |
| 1.5859999999999985 | 34.305 |
| 1.5859999999999985 | 32.855 |
| 1.5859999999999985 | 33.3 |
| 1.5549999999999997 | 31.8 |
| 1.5549999999999997 | 32.583 |
| 1.5549999999999997 | 33.489 |
| 1.5549999999999997 | 33.805 |
| 1.5309999999999988 | 32.944 |
| 1.5309999999999988 | 34.355 |
| 1.5309999999999988 | 34.583 |
| 1.5309999999999988 | 33.661 |
| 1.5159999999999982 | 34.439 |
| 1.5159999999999982 | 35.644 |
| 1.5159999999999982 | 34.022 |
| 1.5159999999999982 | 33.089 |
| 1.4920000000000009 | 33.439 |
| 1.4920000000000009 | 33.344 |
| 1.4920000000000009 | 32.094 |
| 1.4920000000000009 | 31.094 |
| 1.4609999999999985 | 33.216 |
| 1.4609999999999985 | 34.044 |
| 1.4609999999999985 | 34.316 |
| 1.4609999999999985 | 34.65 |
| 1.4379999999999988 | 33.911 |
| 1.4379999999999988 | 31.922 |
| 1.4379999999999988 | 33.327 |
| 1.4379999999999988 | 32.039 |
| 1.4059999999999988 | 32.483 |
| 1.4059999999999988 | 31.294 |
| 1.4059999999999988 | 31.483 |
| 1.4059999999999988 | 30.189 |
| 1.3909999999999982 | 31.816 |
| 1.3909999999999982 | 30.761 |
| 1.3909999999999982 | 31.6 |
| 1.3909999999999982 | 30.766 |
| 1.3590000000000018 | 30.672 |
| 1.3590000000000018 | 31.211 |
| 1.3590000000000018 | 29.855 |
| 1.3590000000000018 | 29.989 |
| 1.3440000000000012 | 30.839 |
| 1.3440000000000012 | 30.639 |
| 1.3440000000000012 | 28.805 |
| 1.3440000000000012 | 30.389 |
| 1.3049999999999997 | 28.516 |
| 1.3049999999999997 | 30.222 |
| 1.3049999999999997 | 29.083 |
| 1.3049999999999997 | 29.666 |
| 1.2809999999999988 | 31.25 |
| 1.2809999999999988 | 29.505 |
| 1.2809999999999988 | 31.016 |
| 1.2809999999999988 | 28.9 |
| 1.2579999999999991 | 28.25 |
| 1.2579999999999991 | 29.972 |
| 1.2579999999999991 | 31.539 |
| 1.2579999999999991 | 31.983 |
| 1.2420000000000009 | 29.244 |
| 1.2420000000000009 | 29.716 |
| 1.2420000000000009 | 28.194 |
| 1.2420000000000009 | 29.333 |
| 1.2029999999999994 | 30.2 |
| 1.2029999999999994 | 29.344 |
| 1.2029999999999994 | 29.25 |
| 1.2029999999999994 | 29.777 |
| 1.1640000000000015 | 27.989 |
| 1.1640000000000015 | 29.489 |
| 1.1640000000000015 | 29.111 |
| 1.1640000000000015 | 27.939 |
| 1.1409999999999982 | 26.911 |
| 1.1409999999999982 | 26.589 |
| 1.1409999999999982 | 27.139 |
| 1.1409999999999982 | 28.639 |
| 1.125 | 28.511 |
| 1.125 | 28.483 |
| 1.125 | 27.7 |
| 1.125 | 29.933 |
| 1.0940000000000012 | 27.222 |
| 1.0940000000000012 | 27.6 |
| 1.0940000000000012 | 26.722 |
| 1.0940000000000012 | 28.144 |
| 1.0549999999999997 | 28.205 |
| 1.0549999999999997 | 28.883 |
| 1.0549999999999997 | 28.955 |
| 1.0549999999999997 | 28.266 |
| 1.0390000000000015 | 28.789 |
| 1.0390000000000015 | 27.2 |
| 1.0390000000000015 | 28.155 |
| 1.0390000000000015 | 27.611 |
| 1.0 | 27.844 |
| 1.0 | 26.9 |
| 1.0 | 27.366 |
| 1.0 | 26.122 |
| 0.9770000000000003 | 25.094 |
| 0.9770000000000003 | 26.311 |
| 0.9770000000000003 | 22.494 |
| 0.9770000000000003 | 25.822 |
| 0.9529999999999994 | 27.078 |
| 0.9529999999999994 | 29.255 |
| 0.9529999999999994 | 28.128 |
| 0.9529999999999994 | 26.561 |
| 0.9220000000000006 | 28.394 |
| 0.9220000000000006 | 27.089 |
| 0.9220000000000006 | 26.905 |
| 0.9220000000000006 | 26.161 |
| 0.9220000000000006 | 26.261 |
| 0.9220000000000006 | 25.972 |
| 0.9220000000000006 | 24.239 |
| 0.9220000000000006 | 23.922 |
| 0.8909999999999982 | 22.933 |
| 0.8909999999999982 | 23.305 |
| 0.8909999999999982 | 24.172 |
| 0.8909999999999982 | 25.027 |
| 0.8670000000000009 | 24.255 |
| 0.8670000000000009 | 23.028 |
| 0.8670000000000009 | 22.772 |
| 0.8670000000000009 | 21.583 |
| 0.8279999999999994 | 22.25 |
| 0.8279999999999994 | 23.583 |
| 0.8279999999999994 | 22.333 |
| 0.8279999999999994 | 23.933 |
| 0.7970000000000006 | 24.7 |
| 0.7970000000000006 | 25.116 |
| 0.7970000000000006 | 24.266 |
| 0.7970000000000006 | 22.122 |
| 0.7809999999999988 | 23.105 |
| 0.7809999999999988 | 23.022 |
| 0.7809999999999988 | 23.533 |
| 0.7809999999999988 | 23.961 |
| 0.75 | 25.455 |
| 0.75 | 23.1 |
| 0.75 | 22.794 |
| 0.75 | 21.628 |
| 0.7109999999999985 | 22.911 |
| 0.7109999999999985 | 22.739 |
| 0.7109999999999985 | 21.639 |
| 0.7109999999999985 | 22.322 |
| 0.6950000000000003 | 21.105 |
| 0.6950000000000003 | 21.75 |
| 0.6950000000000003 | 23.989 |
| 0.6950000000000003 | 22.233 |
| 0.6640000000000015 | 21.344 |
| 0.6640000000000015 | 21.461 |
| 0.6640000000000015 | 20.927 |
| 0.6640000000000015 | 20.578 |
| 0.6329999999999991 | 23.272 |
| 0.6329999999999991 | 21.778 |
| 0.6329999999999991 | 21.522 |
| 0.6329999999999991 | 21.272 |
| 0.6090000000000018 | 20.883 |
| 0.6090000000000018 | 22.639 |
| 0.6090000000000018 | 21.639 |
| 0.6090000000000018 | 22.061 |
| 0.5779999999999994 | 21.583 |
| 0.5779999999999994 | 23.455 |
| 0.5779999999999994 | 22.083 |
| 0.5779999999999994 | 20.2 |
| 0.5549999999999997 | 22.028 |
| 0.5549999999999997 | 23.639 |
| 0.5549999999999997 | 22.061 |
| 0.5549999999999997 | 22.333 |
| 0.5309999999999988 | 24.394 |
| 0.5309999999999988 | 22.078 |
| 0.5309999999999988 | 20.666 |
| 0.5309999999999988 | 22.5 |
| 0.5079999999999991 | 19.966 |
| 0.5079999999999991 | 19.694 |
| 0.5079999999999991 | 22.039 |
| 0.5079999999999991 | 21.372 |
| 0.4770000000000003 | 21.089 |
| 0.4770000000000003 | 20.2 |
| 0.4770000000000003 | 21.072 |
| 0.4770000000000003 | 20.078 |
| 0.4529999999999994 | 19.544 |
| 0.4529999999999994 | 21.016 |
| 0.4529999999999994 | 19.439 |
| 0.4529999999999994 | 21.205 |
| 0.4299999999999997 | 19.911 |
| 0.4299999999999997 | 19.867 |
| 0.4299999999999997 | 20.822 |
| 0.4299999999999997 | 21.155 |
| 0.4059999999999988 | 21.905 |
| 0.4059999999999988 | 22.739 |
| 0.4059999999999988 | 22.583 |
| 0.4059999999999988 | 21.616 |
| 0.375 | 23.261 |
| 0.375 | 20.994 |
| 0.375 | 21.789 |
| 0.375 | 20.616 |
| 0.3520000000000003 | 18.272 |
| 0.3520000000000003 | 17.583 |
| 0.3520000000000003 | 17.978 |
| 0.3520000000000003 | 17.744 |
| 0.3279999999999994 | 17.594 |
| 0.3279999999999994 | 17.572 |
| 0.3279999999999994 | 26.566 |
| 0.3279999999999994 | 18.783 |
| 0.3049999999999997 | 17.694 |
| 0.3049999999999997 | 17.7 |
| 0.3049999999999997 | 18.061 |
| 0.3049999999999997 | 18.716 |
| 0.2729999999999997 | 17.566 |
| 0.2729999999999997 | 16.944 |
| 0.2729999999999997 | 15.833 |
| 0.2729999999999997 | 14.744 |
| 0.2579999999999991 | 15.544 |
| 0.2579999999999991 | 15.855 |
| 0.2579999999999991 | 14.828 |
| 0.2579999999999991 | 16.755 |
| 0.2270000000000003 | 16.877 |
| 0.2270000000000003 | 17.266 |
| 0.2270000000000003 | 16.583 |
| 0.2270000000000003 | 15.361 |
| 0.21099999999999852 | 16.183 |
| 0.21099999999999852 | 17.45 |
| 0.21099999999999852 | 16.878 |
| 0.21099999999999852 | 20.066 |
| 0.18799999999999883 | 16.455 |
| 0.18799999999999883 | 16.928 |
| 0.18799999999999883 | 17.383 |
| 0.18799999999999883 | 18.061 |
| 0.1559999999999988 | 16.828 |
| 0.1559999999999988 | 17.539 |
| 0.1559999999999988 | 15.333 |
| 0.1559999999999988 | 17.483 |
| 0.13299999999999912 | 15.855 |
| 0.13299999999999912 | 16 |
| 0.13299999999999912 | 16.883 |
| 0.13299999999999912 | 14 |
| 0.10200000000000031 | 16.289 |
| 0.10200000000000031 | 15.594 |
| 0.10200000000000031 | 16.083 |
| 0.10200000000000031 | 15.105 |
| 0.10200000000000031 | 14.35 |
| 0.10200000000000031 | 14.289 |
| 0.10200000000000031 | 13.739 |
| 0.10200000000000031 | 11.094 |
| 0.08599999999999852 | 13.3 |
| 0.08599999999999852 | 11.983 |
| 0.08599999999999852 | 12.517 |
| 0.08599999999999852 | 13.833 |
| 0.0470000000000006 | 14.25 |
| 0.0470000000000006 | 14.6 |
| 0.0470000000000006 | 13.205 |
| 0.0470000000000006 | 13.178 |
| 0.022999999999999687 | 12.994 |
| 0.022999999999999687 | 13.205 |
| 0.022999999999999687 | 13.239 |
| 0.022999999999999687 | 13.022 |
| -0.015999999999998238 | 13.739 |
| -0.015999999999998238 | 13.055 |
| -0.015999999999998238 | 13.822 |
| -0.015999999999998238 | 13.25 |
| -0.030999999999998806 | 13.028 |
| -0.030999999999998806 | 11.722 |
| -0.030999999999998806 | 13 |
| -0.030999999999998806 | 12.744 |
| -0.062000000000001165 | 13.855 |
| -0.062000000000001165 | 14.544 |
| -0.062000000000001165 | 14.533 |
| -0.062000000000001165 | 14.067 |
| -0.0940000000000012 | 15.044 |
| -0.0940000000000012 | 14.089 |
| -0.0940000000000012 | 11.483 |
| -0.0940000000000012 | 8.033 |
| -0.125 | 9.972 |
| -0.125 | 12.1 |
| -0.125 | 11.144 |
| -0.125 | 9.833 |
| -0.14099999999999824 | 11.239 |
| -0.14099999999999824 | 10.811 |
| -0.14099999999999824 | 10.233 |
| -0.14099999999999824 | 12.2 |
| -0.17999999999999972 | 10.694 |
| -0.17999999999999972 | 12.122 |
| -0.17999999999999972 | 9.967 |
| -0.17999999999999972 | 10.717 |
| -0.2029999999999994 | 11.133 |
| -0.2029999999999994 | 11.844 |
| -0.2029999999999994 | 8.139 |
| -0.23400000000000176 | 9.417 |
| -0.23400000000000176 | 10.611 |
| -0.23400000000000176 | 10.717 |
| -0.23400000000000176 | 9.478 |
| -0.23400000000000176 | 10.133 |
| -0.2579999999999991 | 9.822 |
| -0.2579999999999991 | 9.678 |
| -0.2579999999999991 | 10.417 |
| -0.2579999999999991 | 9.3 |
| -0.2729999999999997 | 10.733 |
| -0.2729999999999997 | 10.433 |
| -0.2729999999999997 | 10.422 |
| -0.2729999999999997 | 10.411 |
| -0.2890000000000015 | 11.939 |
| -0.2890000000000015 | 11.028 |
| -0.2890000000000015 | 11.872 |
| -0.2890000000000015 | 11.061 |
| -0.3200000000000003 | 12.478 |
| -0.3200000000000003 | 11.239 |
| -0.3200000000000003 | 9.95 |
| -0.3200000000000003 | 9.922 |
| -0.3279999999999994 | 10.405 |
| -0.3279999999999994 | 8.205 |
| -0.3279999999999994 | 6.239 |
| -0.3279999999999994 | 7.178 |
| -0.3440000000000012 | 9.15 |
| -0.3440000000000012 | 9.828 |
| -0.3440000000000012 | 8.517 |
| -0.3440000000000012 | 9.078 |
| -0.3520000000000003 | 9.305 |
| -0.3520000000000003 | 9.994 |
| -0.3520000000000003 | 9.422 |
| -0.3520000000000003 | 10.728 |
| -0.35900000000000176 | 8.939 |
| -0.35900000000000176 | 8.439 |
| -0.35900000000000176 | 9.617 |
| -0.35900000000000176 | 9.55 |
| -0.3670000000000009 | 9.4 |
| -0.3670000000000009 | 10.789 |
| -0.3670000000000009 | 9.75 |
| -0.3670000000000009 | 9.389 |
| -0.3670000000000009 | 7.072 |
| -0.3670000000000009 | 8.456 |
| -0.3670000000000009 | 8.711 |
| -0.3670000000000009 | 10.955 |
| -0.375 | 10.4 |
| -0.375 | 12.005 |
| -0.375 | 9.472 |
| -0.375 | 6.944 |
| -0.3670000000000009 | 7.228 |
| -0.3670000000000009 | 6.033 |
| -0.3670000000000009 | 8.578 |
| -0.3670000000000009 | 6.211 |
| -0.375 | 5.983 |
| -0.375 | 6.161 |
| -0.375 | 6.072 |
| -0.375 | 5.289 |
| -0.3670000000000009 | 5.772 |
| -0.3670000000000009 | 5.322 |
| -0.3670000000000009 | 6.339 |
| -0.3670000000000009 | 5.044 |
| -0.3670000000000009 | 4.328 |
| -0.3670000000000009 | 3.161 |
| -0.3670000000000009 | 4.55 |
| -0.3670000000000009 | 6.328 |
| -0.35900000000000176 | 4.967 |
| -0.35900000000000176 | 4.633 |
| -0.35900000000000176 | 4.706 |
| -0.35900000000000176 | 3.122 |
| -0.3520000000000003 | 3.617 |
| -0.3520000000000003 | 4.65 |
| -0.3520000000000003 | 4.006 |
| -0.3520000000000003 | 7.194 |
| -0.3440000000000012 | 7.833 |
| -0.3440000000000012 | 8.811 |
| -0.3440000000000012 | 6.733 |
| -0.3440000000000012 | 5.733 |
| -0.3440000000000012 | 7.789 |
| -0.3440000000000012 | 4.967 |
| -0.3440000000000012 | 5.5 |
| -0.3440000000000012 | 3.722 |
| -0.3440000000000012 | 5.067 |
| -0.3440000000000012 | 4.544 |
| -0.3440000000000012 | 4.372 |
| -0.3440000000000012 | 4.9 |
| -0.3279999999999994 | 4.528 |
| -0.3279999999999994 | 3.7 |
| -0.3279999999999994 | 1.783 |
| -0.3279999999999994 | 2.033 |
| -0.3200000000000003 | 3.472 |
| -0.3200000000000003 | 4.5 |
| -0.3200000000000003 | 5.578 |
| -0.3200000000000003 | 6.255 |
| -0.31200000000000117 | 5.1 |
| -0.31200000000000117 | 5.767 |
| -0.31200000000000117 | 5.683 |
| -0.31200000000000117 | 5.411 |
| -0.3049999999999997 | 4.283 |
| -0.3049999999999997 | 4.872 |
| -0.3049999999999997 | 3.372 |
| -0.3049999999999997 | 3.022 |
| -0.2890000000000015 | 4.917 |
| -0.2890000000000015 | 1.883 |
| -0.2890000000000015 | 2.511 |
| -0.2890000000000015 | 2.555 |
| -0.2890000000000015 | 2.422 |
| -0.2890000000000015 | 1.211 |
| -0.2890000000000015 | 1.572 |
| -0.2890000000000015 | 2.128 |
| -0.2729999999999997 | 3.45 |
| -0.2729999999999997 | 3.372 |
| -0.2729999999999997 | 1.656 |
| -0.2729999999999997 | 2.622 |
| -0.26599999999999824 | 2.778 |
| -0.26599999999999824 | 3.2 |
| -0.26599999999999824 | 4.094 |
| -0.26599999999999824 | 2.178 |
| -0.2579999999999991 | 3.217 |
| -0.2579999999999991 | 2.878 |
| -0.2579999999999991 | 2.478 |
| -0.2579999999999991 | 1.778 |
| -0.2579999999999991 | 3.861 |
| -0.2579999999999991 | 3.311 |
| -0.2579999999999991 | 1.317 |
| -0.2579999999999991 | 2.1 |
| -0.24200000000000088 | 1.678 |
| -0.24200000000000088 | 2.361 |
| -0.24200000000000088 | 0.761 |
| -0.24200000000000088 | 1.7 |
| -0.24200000000000088 | 0.517 |
| -0.24200000000000088 | -1.767 |
| -0.24200000000000088 | 0.1 |
| -0.24200000000000088 | -0.867 |
| -0.23400000000000176 | -0.6 |
| -0.23400000000000176 | -0.111 |
| -0.23400000000000176 | -2 |
| -0.23400000000000176 | -0.139 |
| -0.2270000000000003 | -1.617 |
| -0.2270000000000003 | 2.005 |
| -0.2270000000000003 | 0.033 |
| -0.2270000000000003 | 1.294 |
| -0.2270000000000003 | 1.7 |
| -0.2270000000000003 | 0.544 |
| -0.2270000000000003 | -1 |
| -0.2270000000000003 | -0.733 |
| -0.2270000000000003 | -1.689 |
| -0.2270000000000003 | 0.978 |
| -0.2270000000000003 | 1.567 |
| -0.2270000000000003 | -0.9 |
| -0.2190000000000012 | -0.533 |
| -0.2190000000000012 | -1.078 |
| -0.2190000000000012 | -1.078 |
| -0.2190000000000012 | 0.944 |
| -0.2190000000000012 | 0.333 |
| -0.2190000000000012 | 0.328 |
| -0.2190000000000012 | 2.039 |
| -0.2190000000000012 | 2.028 |
| -0.21099999999999852 | 2.556 |
| -0.21099999999999852 | 0.756 |
| -0.21099999999999852 | 2.422 |
| -0.21099999999999852 | 2.028 |
| -0.21099999999999852 | 1.933 |
| -0.21099999999999852 | -0.811 |
| -0.21099999999999852 | 0.161 |
| -0.21099999999999852 | -1.122 |
| -0.2190000000000012 | 1.85 |
| -0.2190000000000012 | 1.15 |
| -0.2190000000000012 | -0.594 |
| -0.2190000000000012 | 0.017 |
| -0.21099999999999852 | -0.083 |
| -0.21099999999999852 | -0.422 |
| -0.21099999999999852 | -0.067 |
| -0.21099999999999852 | 1.222 |
| -0.21099999999999852 | 0.583 |
| -0.21099999999999852 | -0.017 |
| -0.21099999999999852 | 1.133 |
| -0.21099999999999852 | 0.722 |
| -0.21099999999999852 | 1.828 |
| -0.21099999999999852 | 0.694 |
| -0.21099999999999852 | 0.556 |
| -0.21099999999999852 | 0.472 |
| -0.2190000000000012 | 0.922 |
| -0.2190000000000012 | 0.344 |
| -0.2190000000000012 | -0.011 |
| -0.2190000000000012 | -0.378 |
| -0.21099999999999852 | -0.572 |
| -0.21099999999999852 | 0.122 |
| -0.21099999999999852 | 0.4 |
| -0.21099999999999852 | 1.267 |
| -0.21099999999999852 | 1.811 |
| -0.21099999999999852 | 1.772 |
| -0.21099999999999852 | 2.695 |
| -0.21099999999999852 | 0.339 |
| -0.2029999999999994 | 1.144 |
| -0.2029999999999994 | 0.267 |
| -0.2029999999999994 | 1.805 |
| -0.2029999999999994 | 1.994 |
| -0.2029999999999994 | 3.417 |
| -0.2029999999999994 | 2.872 |
| -0.2029999999999994 | 2.1 |
| -0.2029999999999994 | 1.756 |
| -0.2029999999999994 | -0.139 |
| -0.2029999999999994 | 0.072 |
| -0.2029999999999994 | 0.889 |
| -0.2029999999999994 | 1.533 |
| -0.2029999999999994 | 1.544 |
| -0.2029999999999994 | 0.983 |
| -0.2029999999999994 | 1.344 |
| -0.2029999999999994 | -0.317 |
| -0.2029999999999994 | -0.2 |
| -0.2029999999999994 | -0.072 |
| -0.2029999999999994 | -1.633 |
| -0.2029999999999994 | -2.072 |
| -0.2029999999999994 | -0.533 |
| -0.2029999999999994 | -1.439 |
| -0.2029999999999994 | -0.861 |
| -0.2029999999999994 | -0.9 |
| -0.19500000000000028 | -0.939 |
| -0.19500000000000028 | -1.444 |
| -0.19500000000000028 | 0.489 |
| -0.19500000000000028 | -1.922 |
| -0.19500000000000028 | -0.139 |
| -0.19500000000000028 | -2.355 |
| -0.19500000000000028 | -2.911 |
| -0.19500000000000028 | -2.6 |
| -0.19500000000000028 | -1.261 |
| -0.19500000000000028 | -0.917 |
| -0.19500000000000028 | -1.795 |
| -0.19500000000000028 | -0.945 |
| -0.18799999999999883 | 0.383 |
| -0.18799999999999883 | -0.389 |
| -0.18799999999999883 | 0.422 |
| -0.18799999999999883 | -0.583 |
| -0.18799999999999883 | 0.306 |
| -0.18799999999999883 | -0.489 |
| -0.18799999999999883 | -1.25 |
| -0.18799999999999883 | -1.083 |
| -0.17999999999999972 | -1.428 |
| -0.17999999999999972 | -1.378 |
| -0.17999999999999972 | -0.989 |
| -0.17999999999999972 | 0.461 |
| -0.1720000000000006 | 0.683 |
| -0.1720000000000006 | 1.083 |
| -0.1720000000000006 | 1.928 |
| -0.1720000000000006 | 1.156 |
| -0.17999999999999972 | 1.445 |
| -0.17999999999999972 | 0.022 |
| -0.17999999999999972 | 0 |
| -0.17999999999999972 | 0.083 |
| -0.1720000000000006 | -0.644 |
| -0.1720000000000006 | 0.733 |
| -0.1720000000000006 | -1.428 |
| -0.1720000000000006 | 1.472 |
| -0.16400000000000148 | 2.322 |
| -0.16400000000000148 | 1.656 |
| -0.16400000000000148 | -0.839 |
| -0.16400000000000148 | -1.144 |
| -0.1559999999999988 | -0.367 |
| -0.1559999999999988 | -0.617 |
| -0.1559999999999988 | -0.978 |
| -0.1559999999999988 | 0.666 |
| -0.1559999999999988 | -0.6 |
| -0.1559999999999988 | -0.567 |
| -0.1559999999999988 | -0.617 |
| -0.1559999999999988 | 0.517 |
| -0.1559999999999988 | -0.133 |
| -0.1559999999999988 | -0.3 |
| -0.1559999999999988 | -0.917 |
| -0.1559999999999988 | -1.239 |
| -0.1479999999999997 | -2.634 |
| -0.1479999999999997 | -0.989 |
| -0.1479999999999997 | -1.161 |
| -0.1479999999999997 | -0.633 |
| -0.14099999999999824 | -1.85 |
| -0.14099999999999824 | -0.283 |
| -0.14099999999999824 | -0.022 |
| -0.14099999999999824 | -2.489 |
| -0.14099999999999824 | -3.155 |
| -0.14099999999999824 | -3.828 |
| -0.14099999999999824 | -2.844 |
| -0.14099999999999824 | -2.783 |
| -0.13299999999999912 | -1.311 |
| -0.13299999999999912 | -1.65 |
| -0.13299999999999912 | -0.744 |
| -0.13299999999999912 | -0.472 |
| -0.13299999999999912 | -1.161 |
| -0.13299999999999912 | -1.789 |
| -0.13299999999999912 | -2.372 |
| -0.13299999999999912 | -2.644 |
| -0.125 | -1.256 |
| -0.125 | -0.183 |
| -0.125 | -0.511 |
| -0.125 | 0.239 |
| -0.11700000000000088 | -2.45 |
| -0.11700000000000088 | -0.967 |
| -0.11700000000000088 | 0.25 |
| -0.11700000000000088 | 0.006 |
| -0.11700000000000088 | -1.033 |
| -0.11700000000000088 | -0.539 |
| -0.11700000000000088 | -1.589 |
| -0.11700000000000088 | -2.211 |
| -0.10900000000000176 | -1.783 |
| -0.10900000000000176 | -0.272 |
| -0.10900000000000176 | -2.144 |
| -0.10900000000000176 | 0.561 |
| -0.10900000000000176 | 0.85 |
| -0.10900000000000176 | 0.489 |
| -0.10900000000000176 | -1.578 |
| -0.10900000000000176 | -0.4 |
| -0.11700000000000088 | -0.533 |
| -0.11700000000000088 | -1.167 |
| -0.11700000000000088 | -0.461 |
| -0.11700000000000088 | -1.606 |
| -0.10900000000000176 | -1.6 |
| -0.10900000000000176 | -0.156 |
| -0.10900000000000176 | -2.039 |
| -0.10900000000000176 | -0.345 |
| -0.10900000000000176 | -1.211 |
| -0.10900000000000176 | -2.922 |
| -0.10900000000000176 | -2.717 |
| -0.10900000000000176 | -1.867 |
| -0.10900000000000176 | -1.411 |
| -0.10900000000000176 | -1.761 |
| -0.10900000000000176 | -1.761 |
| -0.10900000000000176 | -2.839 |
| -0.10900000000000176 | -3.195 |
| -0.10900000000000176 | -3.033 |
| -0.10900000000000176 | -3.172 |
| -0.10900000000000176 | -1.928 |
| -0.10900000000000176 | -0.578 |
| -0.10900000000000176 | -2.283 |
| -0.10900000000000176 | -1.806 |
| -0.10900000000000176 | -1.728 |
| -0.10900000000000176 | -2.345 |
| -0.10900000000000176 | -1.522 |
| -0.10900000000000176 | -1.356 |
| -0.10900000000000176 | -0.683 |
| -0.10900000000000176 | -1.15 |
| -0.10900000000000176 | -1 |
| -0.10900000000000176 | -0.594 |
| -0.10900000000000176 | -0.706 |
| -0.10200000000000031 | -0.033 |
| -0.10200000000000031 | 0.567 |
| -0.10200000000000031 | 2.872 |
| -0.10200000000000031 | 2.278 |
| -0.11700000000000088 | 0.272 |
| -0.11700000000000088 | 2.172 |
| -0.11700000000000088 | 1.978 |
| -0.11700000000000088 | 0.317 |
| -0.10900000000000176 | -0.1 |
| -0.10900000000000176 | 1.694 |
| -0.10900000000000176 | 1.428 |
| -0.10900000000000176 | -1.928 |
| -0.10900000000000176 | -0.045 |
| -0.10900000000000176 | 1.128 |
| -0.10900000000000176 | -2.006 |
| -0.10900000000000176 | -2.061 |
| -0.11700000000000088 | -0.156 |
| -0.11700000000000088 | -1.722 |
| -0.11700000000000088 | -0.1 |
| -0.11700000000000088 | -1.861 |
| -0.11700000000000088 | -0.239 |
| -0.11700000000000088 | -0.161 |
| -0.11700000000000088 | 0.611 |
| -0.11700000000000088 | 0.961 |
| -0.11700000000000088 | 0.939 |
| -0.11700000000000088 | 1.283 |
| -0.11700000000000088 | 0.872 |
| -0.11700000000000088 | 1.489 |
| -0.11700000000000088 | 0.055 |
| -0.11700000000000088 | 0.15 |
| -0.11700000000000088 | 1.717 |
| -0.11700000000000088 | 2.533 |
| -0.10900000000000176 | 2.867 |
| -0.10900000000000176 | 1.578 |
| -0.10900000000000176 | 0.939 |
| -0.10900000000000176 | 3.089 |
| -0.11700000000000088 | 0.428 |
| -0.11700000000000088 | -0.222 |
| -0.11700000000000088 | 0.867 |
| -0.11700000000000088 | -0.411 |
| -0.10900000000000176 | 2.233 |
| -0.10900000000000176 | -0.622 |
| -0.10900000000000176 | -0.694 |
| -0.10900000000000176 | -0.495 |
| -0.11700000000000088 | -1.228 |
| -0.11700000000000088 | -1.55 |
| -0.11700000000000088 | -0.811 |
| -0.11700000000000088 | -0.306 |
| -0.10900000000000176 | -0.056 |
| -0.10900000000000176 | -0.644 |
| -0.10900000000000176 | -0.678 |
| -0.10900000000000176 | -1.233 |
| -0.10900000000000176 | -1.795 |
| -0.10900000000000176 | -0.878 |
| -0.10900000000000176 | 0.039 |
| -0.10900000000000176 | -1.411 |
| -0.10900000000000176 | -2.094 |
| -0.10900000000000176 | -0.983 |
| -0.10900000000000176 | 0.528 |
| -0.10900000000000176 | -0.967 |
| -0.10900000000000176 | -2.189 |
| -0.10900000000000176 | -1.311 |
| -0.10900000000000176 | -2.75 |
| -0.10900000000000176 | -1.95 |
| -0.10900000000000176 | -0.422 |
| -0.10900000000000176 | -0.689 |
| -0.10900000000000176 | -1.35 |
| -0.10900000000000176 | -1.922 |
| -0.10200000000000031 | 0.356 |
| -0.10200000000000031 | 1.267 |
| -0.10200000000000031 | -0.667 |
| -0.10200000000000031 | -0.75 |
| -0.10200000000000031 | -0.478 |
| -0.10200000000000031 | 1.022 |
| -0.10200000000000031 | 1.589 |
| -0.10200000000000031 | -0.417 |
| -0.10200000000000031 | -0.133 |
| -0.10200000000000031 | -2.228 |
| -0.10200000000000031 | 0.889 |
| -0.10200000000000031 | -0.528 |
| -0.10200000000000031 | -0.75 |
| -0.10200000000000031 | -1.517 |
| -0.10200000000000031 | -0.606 |
| -0.10200000000000031 | -0.739 |
| -0.0940000000000012 | -1.045 |
| -0.0940000000000012 | 1.361 |
| -0.0940000000000012 | 0.978 |
| -0.0940000000000012 | 0.661 |
| -0.0940000000000012 | 0.661 |
| -0.0940000000000012 | -1.328 |
| -0.0940000000000012 | -0.928 |
| -0.0940000000000012 | -1.717 |
| -0.08599999999999852 | -0.878 |
| -0.08599999999999852 | -2.906 |
| -0.08599999999999852 | -1.883 |
| -0.08599999999999852 | -1.328 |
| -0.0779999999999994 | -1.461 |
| -0.0779999999999994 | -1.95 |
| -0.0779999999999994 | -0.311 |
| -0.0779999999999994 | -0.05 |
| -0.0779999999999994 | -0.545 |
| -0.0779999999999994 | -0.933 |
| -0.0779999999999994 | 5.05 |
| -0.0779999999999994 | -0.389 |
| -0.0779999999999994 | -0.178 |
| -0.0779999999999994 | -0.328 |
| -0.0779999999999994 | -1.856 |
| -0.0779999999999994 | -1.4 |
| -0.0779999999999994 | -1.884 |
| -0.0779999999999994 | -0.917 |
| -0.0779999999999994 | -0.939 |
| -0.0779999999999994 | -1.283 |
| -0.062000000000001165 | -2.833 |
| -0.062000000000001165 | -1.644 |
| -0.062000000000001165 | -1.695 |
| -0.062000000000001165 | 0.45 |
| -0.062000000000001165 | 1.894 |
| -0.062000000000001165 | 0.878 |
| -0.062000000000001165 | 0.628 |
| -0.062000000000001165 | 1.372 |
| -0.07000000000000028 | -0.067 |
| -0.07000000000000028 | 0.711 |
| -0.07000000000000028 | 0.844 |
| -0.07000000000000028 | 0.644 |
| -0.062000000000001165 | 0.978 |
| -0.062000000000001165 | -0.322 |
| -0.062000000000001165 | -1.256 |
| -0.062000000000001165 | -2.217 |
| -0.062000000000001165 | -0.983 |
| -0.062000000000001165 | -0.128 |
| -0.062000000000001165 | -0.589 |
| -0.062000000000001165 | 1.25 |
| -0.054999999999999716 | 0.111 |
| -0.054999999999999716 | -0.711 |
| -0.054999999999999716 | -0.061 |
| -0.054999999999999716 | 0.161 |
| -0.054999999999999716 | 0.161 |
| -0.054999999999999716 | -1.978 |
| -0.054999999999999716 | -1.894 |
| -0.054999999999999716 | -0.306 |
| -0.054999999999999716 | -2.417 |
| -0.054999999999999716 | -0.295 |
| -0.054999999999999716 | -2.106 |
| -0.054999999999999716 | -1.483 |
| -0.0470000000000006 | -3.117 |
| -0.0470000000000006 | 1.717 |
| -0.0470000000000006 | -0.411 |
| -0.0470000000000006 | -0.922 |
| -0.054999999999999716 | 0.183 |
| -0.054999999999999716 | 0.539 |
| -0.054999999999999716 | 0.461 |
| -0.054999999999999716 | 0.067 |
| -0.0470000000000006 | 1.778 |
| -0.0470000000000006 | 1.55 |
| -0.0470000000000006 | 0.417 |
| -0.0470000000000006 | 1.317 |
| -0.0470000000000006 | 1.355 |
| -0.0470000000000006 | 0.667 |
| -0.0470000000000006 | 0.922 |
| -0.0470000000000006 | 0.272 |
| -0.0470000000000006 | 1.178 |
| -0.0470000000000006 | -0.3 |
| -0.0470000000000006 | -0.539 |
| -0.0470000000000006 | -0.822 |
| -0.054999999999999716 | -0.267 |
| -0.054999999999999716 | -1.228 |
| -0.054999999999999716 | 0.389 |
| -0.054999999999999716 | 1.061 |
| -0.054999999999999716 | -1.3 |
| -0.054999999999999716 | -0.1 |
| -0.054999999999999716 | 1.155 |
| -0.054999999999999716 | 1.811 |
| -0.054999999999999716 | -1.339 |
| -0.054999999999999716 | 0.561 |
| -0.054999999999999716 | -0.5 |
| -0.054999999999999716 | -0.722 |
| -0.062000000000001165 | -1.417 |
| -0.062000000000001165 | 0.189 |
| -0.062000000000001165 | -1.306 |
| -0.062000000000001165 | -0.689 |
| -0.054999999999999716 | 0.25 |
| -0.054999999999999716 | -0.628 |
| -0.054999999999999716 | 1.583 |
| -0.054999999999999716 | 1.35 |
| -0.062000000000001165 | 1.983 |
| -0.062000000000001165 | 0.861 |
| -0.062000000000001165 | 3.661 |
| -0.062000000000001165 | 3.622 |
| -0.062000000000001165 | 2.678 |
| -0.062000000000001165 | 3.6 |
| -0.062000000000001165 | 2.578 |
| -0.062000000000001165 | 2.739 |
| -0.062000000000001165 | 1.855 |
| -0.062000000000001165 | 2.011 |
| -0.062000000000001165 | 2.244 |
| -0.062000000000001165 | 0.161 |
| -0.062000000000001165 | 0.817 |
| -0.062000000000001165 | 0.917 |
| -0.062000000000001165 | 2.139 |
| -0.062000000000001165 | 0.5 |
| -0.07000000000000028 | 0.689 |
| -0.07000000000000028 | 1.594 |
| -0.07000000000000028 | 0.028 |
| -0.07000000000000028 | -0.222 |
| -0.07000000000000028 | 2.989 |
| -0.07000000000000028 | 0.583 |
| -0.07000000000000028 | 1.561 |
| -0.07000000000000028 | 0.622 |
| -0.07000000000000028 | 1.733 |
| -0.07000000000000028 | 1.405 |
| -0.07000000000000028 | 2.156 |
| -0.07000000000000028 | 0.533 |
| -0.07000000000000028 | -0.356 |
| -0.07000000000000028 | 0.367 |
| -0.07000000000000028 | 0.222 |
| -0.07000000000000028 | -0.028 |
| -0.07000000000000028 | -0.378 |
| -0.07000000000000028 | 2.144 |
| -0.07000000000000028 | 2.239 |
| -0.07000000000000028 | 2.222 |
| -0.062000000000001165 | -0.006 |
| -0.062000000000001165 | 0.261 |
| -0.062000000000001165 | -0.811 |
| -0.062000000000001165 | 1.033 |
| -0.062000000000001165 | 0.028 |
| -0.062000000000001165 | -1.778 |
| -0.062000000000001165 | 1.378 |
| -0.062000000000001165 | 0.839 |
| -0.062000000000001165 | 0.156 |
| -0.062000000000001165 | -0.156 |
| -0.062000000000001165 | -0.945 |
| -0.062000000000001165 | 0.75 |
| -0.062000000000001165 | -1.167 |
| -0.062000000000001165 | 0.161 |
| -0.062000000000001165 | 0.661 |
| -0.062000000000001165 | 1.544 |
| -0.062000000000001165 | 0.994 |
| -0.062000000000001165 | 0.211 |
| -0.062000000000001165 | 0.572 |
| -0.062000000000001165 | 0.128 |
| -0.062000000000001165 | 1.7 |
| -0.062000000000001165 | 1.155 |
| -0.062000000000001165 | 1.805 |
| -0.062000000000001165 | 0.961 |
| -0.054999999999999716 | 0.15 |
| -0.054999999999999716 | -0.356 |
| -0.054999999999999716 | -0.206 |
| -0.054999999999999716 | -1.661 |
| -0.062000000000001165 | -1.339 |
| -0.062000000000001165 | -1.244 |
| -0.062000000000001165 | -0.417 |
| -0.062000000000001165 | 0.822 |
| -0.054999999999999716 | 1.761 |
| -0.054999999999999716 | 1.106 |
| -0.054999999999999716 | 0.961 |
| -0.054999999999999716 | -0.756 |
| -0.054999999999999716 | -0.411 |
| -0.054999999999999716 | 0.228 |
| -0.054999999999999716 | 0.839 |
| -0.054999999999999716 | 0.639 |
| -0.0470000000000006 | 1.817 |
| -0.0470000000000006 | 2.028 |
| -0.0470000000000006 | 3.394 |
| -0.0470000000000006 | 2.822 |
| -0.0470000000000006 | 1.389 |
| -0.0470000000000006 | 1.961 |
| -0.0470000000000006 | 1.978 |
| -0.0470000000000006 | 2.083 |
| -0.0470000000000006 | 2.872 |
| -0.0470000000000006 | 3.794 |
| -0.0470000000000006 | 2.089 |
| -0.0470000000000006 | 2.589 |
| -0.03900000000000148 | 0.078 |
| -0.03900000000000148 | 2.311 |
| -0.03900000000000148 | 0.705 |
| -0.03900000000000148 | 2.172 |
| -0.03900000000000148 | 1.572 |
| -0.03900000000000148 | -0.083 |
| -0.03900000000000148 | 1.15 |
| -0.03900000000000148 | 1.1 |
| -0.03900000000000148 | -0.683 |
| -0.03900000000000148 | -0.634 |
| -0.03900000000000148 | -0.067 |
| -0.03900000000000148 | 0.805 |
| -0.030999999999998806 | 0.789 |
| -0.030999999999998806 | 0.622 |
| -0.030999999999998806 | 0.544 |
| -0.030999999999998806 | 0.961 |
| -0.030999999999998806 | -0.289 |
| -0.030999999999998806 | -0.75 |
| -0.030999999999998806 | 1.95 |
| -0.030999999999998806 | 2.167 |
| -0.022999999999999687 | 1.344 |
| -0.022999999999999687 | -1.306 |
| -0.022999999999999687 | 0.944 |
| -0.022999999999999687 | -0.122 |
| -0.015999999999998238 | 0.705 |
| -0.015999999999998238 | 0.489 |
| -0.015999999999998238 | 0.25 |
| -0.015999999999998238 | 0.983 |
| -0.022999999999999687 | 1.639 |